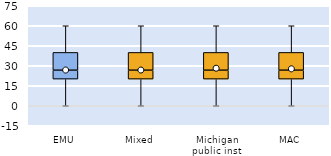
| Category | 25th | 50th | 75th |
|---|---|---|---|
| EMU | 20 | 6.667 | 13.333 |
| Mixed | 20 | 6.667 | 13.333 |
| Michigan public inst | 20 | 6.667 | 13.333 |
| MAC | 20 | 6.667 | 13.333 |